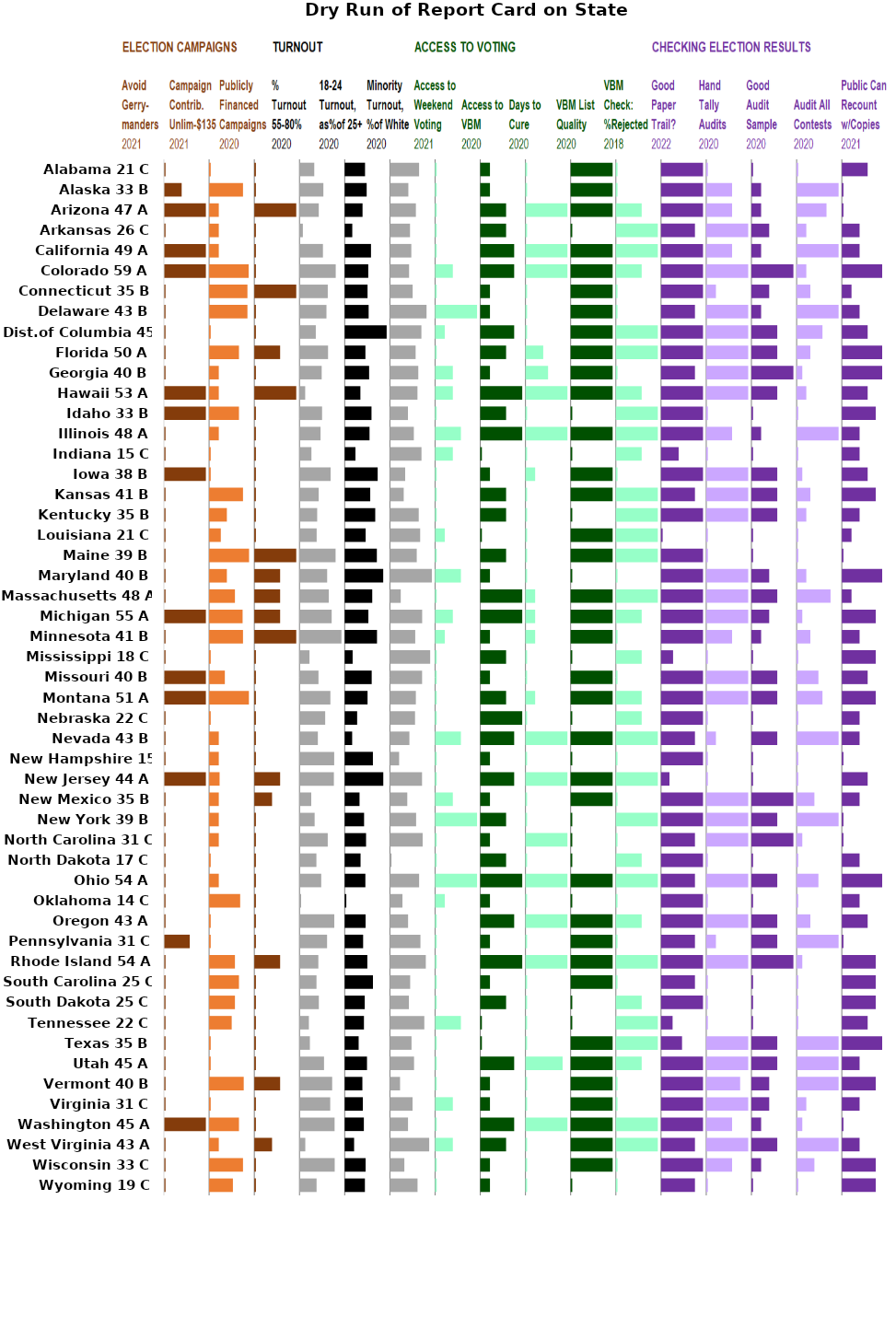
| Category | Nonpartisan or Bipartisan Redistricting to Avoid Gerrymanders | no | Contribution Limit per 4 Years per Candidate | cl | Public Campaign Finance for Governor+Legislature: | $ | Turnout: % of Voting-age Citizens: 2020: | tu | Ratio of 18-24 Turnout to 25+ Turnout: 2020: | t18 | Ratio of Minority Turnout to White Turnout: 2020: | tm | Weekend Early Voting: State Minimum 2021: | we | Access to Vote by Mail (VBM): 2020: | nr | Number of Days when Voters Can Cure Signature Problems after Election Day: | ho | Do They Maintain VBM List Well with Address Changes & Deaths? | go | Extent of Review of VBM: Rejection Rate: 2018: | ab | Handmarked Paper Ballots or Printed by Touchscreen? 2022: | do | Do They Audit Results by Hand Tallying Some Ballots? | ha | How Big Is Audit Sample? | ad | Number of Contests Audited: | nu | Can Public Recount with Copies of Ballots? | re |
|---|---|---|---|---|---|---|---|---|---|---|---|---|---|---|---|---|---|---|---|---|---|---|---|---|---|---|---|---|---|---|---|---|
| Alabama 21 C | 0.2 | 5.4 | 0.2 | 5.4 | 0.2 | 5.4 | 1.829 | 3.771 | 2.521 | 3.079 | 3.619 | 1.981 | 0.2 | 5.4 | 1.2 | 4.4 | 0.2 | 5.4 | 5.2 | 0.4 | 0.2 | 5.4 | 5.2 | 0.4 | 0.2 | 5.4 | 0.2 | 5.4 | 0.2 | 5.4 | 3.2 | 2.4 |
| Alaska 33 B | 2.2 | 3.4 | 4.2 | 1.4 | 0.2 | 5.4 | 2.958 | 2.642 | 2.724 | 2.876 | 2.288 | 3.312 | 0.2 | 5.4 | 1.2 | 4.4 | 0.2 | 5.4 | 5.2 | 0.4 | 0.2 | 5.4 | 5.2 | 0.4 | 3.2 | 2.4 | 1.2 | 4.4 | 5.2 | 0.4 | 0.2 | 5.4 |
| Arizona 47 A | 5.2 | 0.4 | 1.2 | 4.4 | 5.2 | 0.4 | 2.389 | 3.211 | 2.212 | 3.388 | 3.222 | 2.378 | 0.2 | 5.4 | 3.2 | 2.4 | 5.2 | 0.4 | 5.2 | 0.4 | 3.2 | 2.4 | 5.2 | 0.4 | 3.2 | 2.4 | 1.2 | 4.4 | 3.7 | 1.9 | 0.2 | 5.4 |
| Arkansas 26 C | 0.2 | 5.4 | 1.2 | 4.4 | 0.2 | 5.4 | 0.416 | 5.184 | 0.941 | 4.659 | 2.495 | 3.105 | 0.2 | 5.4 | 3.2 | 2.4 | 0.2 | 5.4 | 0.2 | 5.4 | 5.2 | 0.4 | 4.2 | 1.4 | 5.2 | 0.4 | 2.2 | 3.4 | 1.2 | 4.4 | 2.2 | 3.4 |
| California 49 A | 5.2 | 0.4 | 1.2 | 4.4 | 0.2 | 5.4 | 2.905 | 2.695 | 3.261 | 2.339 | 2.656 | 2.944 | 0.2 | 5.4 | 4.2 | 1.4 | 5.2 | 0.4 | 5.2 | 0.4 | 5.2 | 0.4 | 5.2 | 0.4 | 3.2 | 2.4 | 1.2 | 4.4 | 5.2 | 0.4 | 2.2 | 3.4 |
| Colorado 59 A | 5.2 | 0.4 | 4.9 | 0.7 | 0.2 | 5.4 | 4.49 | 1.11 | 2.921 | 2.679 | 2.379 | 3.221 | 2.2 | 3.4 | 4.2 | 1.4 | 5.2 | 0.4 | 5.2 | 0.4 | 3.2 | 2.4 | 5.2 | 0.4 | 5.2 | 0.4 | 5.2 | 0.4 | 1.2 | 4.4 | 5.2 | 0.4 |
| Connecticut 35 B | 0.2 | 5.4 | 4.75 | 0.85 | 5.2 | 0.4 | 3.504 | 2.096 | 2.832 | 2.768 | 2.82 | 2.78 | 0.2 | 5.4 | 1.2 | 4.4 | 0.2 | 5.4 | 5.2 | 0.4 | 0.2 | 5.4 | 5.2 | 0.4 | 1.2 | 4.4 | 2.2 | 3.4 | 1.7 | 3.9 | 1.2 | 4.4 |
| Delaware 43 B | 0.2 | 5.4 | 4.75 | 0.85 | 0.2 | 5.4 | 3.341 | 2.259 | 2.968 | 2.632 | 4.542 | 1.058 | 5.2 | 0.4 | 1.2 | 4.4 | 0.2 | 5.4 | 5.2 | 0.4 | 0.2 | 5.4 | 4.2 | 1.4 | 5.2 | 0.4 | 1.2 | 4.4 | 5.2 | 0.4 | 2.2 | 3.4 |
| Dist.of Columbia 45 A | 0.2 | 5.4 | 0.2 | 5.4 | 0.2 | 5.4 | 2.021 | 3.579 | 5.2 | 0.4 | 3.905 | 1.695 | 1.2 | 4.4 | 4.2 | 1.4 | 0.2 | 5.4 | 5.2 | 0.4 | 5.2 | 0.4 | 5.2 | 0.4 | 5.2 | 0.4 | 3.2 | 2.4 | 3.2 | 2.4 | 3.2 | 2.4 |
| Florida 50 A | 0.2 | 5.4 | 3.7 | 1.9 | 3.2 | 2.4 | 3.539 | 2.061 | 2.568 | 3.032 | 3.189 | 2.411 | 0.2 | 5.4 | 3.2 | 2.4 | 2.2 | 3.4 | 5.2 | 0.4 | 5.2 | 0.4 | 5.2 | 0.4 | 5.2 | 0.4 | 3.2 | 2.4 | 1.7 | 3.9 | 5.2 | 0.4 |
| Georgia 40 B | 0.2 | 5.4 | 1.2 | 4.4 | 0.2 | 5.4 | 2.75 | 2.85 | 3.028 | 2.572 | 3.519 | 2.081 | 2.2 | 3.4 | 1.2 | 4.4 | 2.8 | 2.8 | 5.2 | 0.4 | 0.2 | 5.4 | 4.2 | 1.4 | 5.2 | 0.4 | 5.2 | 0.4 | 0.7 | 4.9 | 5.2 | 0.4 |
| Hawaii 53 A | 5.2 | 0.4 | 1.2 | 4.4 | 5.2 | 0.4 | 0.707 | 4.893 | 1.946 | 3.654 | 3.416 | 2.184 | 2.2 | 3.4 | 5.2 | 0.4 | 5.2 | 0.4 | 5.2 | 0.4 | 3.2 | 2.4 | 5.2 | 0.4 | 5.2 | 0.4 | 3.2 | 2.4 | 1.2 | 4.4 | 3.2 | 2.4 |
| Idaho 33 B | 5.2 | 0.4 | 3.7 | 1.9 | 0.2 | 5.4 | 2.797 | 2.803 | 3.322 | 2.278 | 2.237 | 3.363 | 0.2 | 5.4 | 3.2 | 2.4 | 0.2 | 5.4 | 0.2 | 5.4 | 5.2 | 0.4 | 5.2 | 0.4 | 0.2 | 5.4 | 0.2 | 5.4 | 0.2 | 5.4 | 4.2 | 1.4 |
| Illinois 48 A | 0.2 | 5.4 | 1.2 | 4.4 | 0.2 | 5.4 | 2.609 | 2.991 | 3.078 | 2.522 | 2.968 | 2.632 | 3.2 | 2.4 | 5.2 | 0.4 | 5.2 | 0.4 | 5.2 | 0.4 | 5.2 | 0.4 | 5.2 | 0.4 | 3.2 | 2.4 | 1.2 | 4.4 | 5.2 | 0.4 | 2.2 | 3.4 |
| Indiana 15 C | 0.2 | 5.4 | 0.2 | 5.4 | 0.2 | 5.4 | 1.477 | 4.123 | 1.332 | 4.268 | 3.915 | 1.685 | 2.2 | 3.4 | 0.2 | 5.4 | 0.2 | 5.4 | 0.2 | 5.4 | 3.2 | 2.4 | 2.18 | 3.42 | 0.2 | 5.4 | 0.2 | 5.4 | 0.2 | 5.4 | 2.2 | 3.4 |
| Iowa 38 B | 5.2 | 0.4 | 0.2 | 5.4 | 0.2 | 5.4 | 3.856 | 1.744 | 4.088 | 1.512 | 1.895 | 3.705 | 0.2 | 5.4 | 1.2 | 4.4 | 1.2 | 4.4 | 5.2 | 0.4 | 0.2 | 5.4 | 5.2 | 0.4 | 5.2 | 0.4 | 3.2 | 2.4 | 0.7 | 4.9 | 3.2 | 2.4 |
| Kansas 41 B | 0.2 | 5.4 | 4.2 | 1.4 | 0.2 | 5.4 | 2.377 | 3.223 | 3.165 | 2.435 | 1.714 | 3.886 | 0.2 | 5.4 | 3.2 | 2.4 | 0.2 | 5.4 | 5.2 | 0.4 | 5.2 | 0.4 | 4.2 | 1.4 | 5.2 | 0.4 | 3.2 | 2.4 | 1.7 | 3.9 | 4.2 | 1.4 |
| Kentucky 35 B | 0.2 | 5.4 | 2.2 | 3.4 | 0.2 | 5.4 | 2.192 | 3.408 | 3.786 | 1.814 | 3.575 | 2.025 | 0.2 | 5.4 | 3.2 | 2.4 | 0.2 | 5.4 | 0.2 | 5.4 | 5.2 | 0.4 | 5.2 | 0.4 | 5.2 | 0.4 | 3.2 | 2.4 | 1.2 | 4.4 | 2.2 | 3.4 |
| Louisiana 21 C | 0.2 | 5.4 | 1.45 | 4.15 | 0.2 | 5.4 | 2.127 | 3.473 | 2.597 | 3.003 | 3.751 | 1.849 | 1.2 | 4.4 | 0.2 | 5.4 | 0.2 | 5.4 | 5.2 | 0.4 | 5.2 | 0.4 | 0.2 | 5.4 | 0.2 | 5.4 | 0.2 | 5.4 | 0.2 | 5.4 | 1.2 | 4.4 |
| Maine 39 B | 0.2 | 5.4 | 4.952 | 0.648 | 5.2 | 0.4 | 4.472 | 1.128 | 3.986 | 1.614 | 3.329 | 2.271 | 0.2 | 5.4 | 3.2 | 2.4 | 0.2 | 5.4 | 5.2 | 0.4 | 5.2 | 0.4 | 5.2 | 0.4 | 0.2 | 5.4 | 0.2 | 5.4 | 0.2 | 5.4 | 0.2 | 5.4 |
| Maryland 40 B | 0.2 | 5.4 | 2.2 | 3.4 | 3.2 | 2.4 | 3.427 | 2.173 | 4.773 | 0.827 | 5.2 | 0.4 | 3.2 | 2.4 | 1.2 | 4.4 | 0.2 | 5.4 | 0.2 | 5.4 | 0.2 | 5.4 | 5.2 | 0.4 | 5.2 | 0.4 | 2.2 | 3.4 | 1.2 | 4.4 | 5.2 | 0.4 |
| Massachusetts 48 A | 0.2 | 5.4 | 3.2 | 2.4 | 3.2 | 2.4 | 3.628 | 1.972 | 3.413 | 2.187 | 1.344 | 4.256 | 0.2 | 5.4 | 5.2 | 0.4 | 1.2 | 4.4 | 5.2 | 0.4 | 5.2 | 0.4 | 5.2 | 0.4 | 5.2 | 0.4 | 3.2 | 2.4 | 4.2 | 1.4 | 1.2 | 4.4 |
| Michigan 55 A | 5.2 | 0.4 | 4.15 | 1.45 | 3.2 | 2.4 | 3.986 | 1.614 | 2.935 | 2.665 | 4 | 1.6 | 2.2 | 3.4 | 5.2 | 0.4 | 1.2 | 4.4 | 5.2 | 0.4 | 3.2 | 2.4 | 5.2 | 0.4 | 5.2 | 0.4 | 2.2 | 3.4 | 0.7 | 4.9 | 4.2 | 1.4 |
| Minnesota 41 B | 0.2 | 5.4 | 4.2 | 1.4 | 5.2 | 0.4 | 5.2 | 0.4 | 4.004 | 1.596 | 3.141 | 2.459 | 1.2 | 4.4 | 1.2 | 4.4 | 1.2 | 4.4 | 5.2 | 0.4 | 0.2 | 5.4 | 5.2 | 0.4 | 3.2 | 2.4 | 1.2 | 4.4 | 1.7 | 3.9 | 2.2 | 3.4 |
| Mississippi 18 C | 0.2 | 5.4 | 0.2 | 5.4 | 0.2 | 5.4 | 1.238 | 4.362 | 0.985 | 4.615 | 4.991 | 0.609 | 0.2 | 5.4 | 3.2 | 2.4 | 0.2 | 5.4 | 0.2 | 5.4 | 3.2 | 2.4 | 1.49 | 4.11 | 0.2 | 5.4 | 0.2 | 5.4 | 0.2 | 5.4 | 4.2 | 1.4 |
| Missouri 40 B | 5.2 | 0.4 | 1.95 | 3.65 | 0.2 | 5.4 | 2.352 | 3.248 | 3.347 | 2.253 | 3.991 | 1.609 | 0.2 | 5.4 | 1.2 | 4.4 | 0.2 | 5.4 | 5.2 | 0.4 | 0.2 | 5.4 | 5.2 | 0.4 | 5.2 | 0.4 | 3.2 | 2.4 | 2.7 | 2.9 | 3.2 | 2.4 |
| Montana 51 A | 5.2 | 0.4 | 4.93 | 0.67 | 0.2 | 5.4 | 3.827 | 1.773 | 2.833 | 2.767 | 3.217 | 2.383 | 0.2 | 5.4 | 3.2 | 2.4 | 1.2 | 4.4 | 5.2 | 0.4 | 3.2 | 2.4 | 5.2 | 0.4 | 5.2 | 0.4 | 3.2 | 2.4 | 3.2 | 2.4 | 4.2 | 1.4 |
| Nebraska 22 C | 0.2 | 5.4 | 0.2 | 5.4 | 0.2 | 5.4 | 3.183 | 2.417 | 1.543 | 4.057 | 3.116 | 2.484 | 0.2 | 5.4 | 5.2 | 0.4 | 0.2 | 5.4 | 0.2 | 5.4 | 3.2 | 2.4 | 5.2 | 0.4 | 0.2 | 5.4 | 0.2 | 5.4 | 0.2 | 5.4 | 2.2 | 3.4 |
| Nevada 43 B | 0.2 | 5.4 | 1.2 | 4.4 | 0.2 | 5.4 | 2.276 | 3.324 | 0.926 | 4.674 | 2.418 | 3.182 | 3.2 | 2.4 | 4.2 | 1.4 | 5.2 | 0.4 | 5.2 | 0.4 | 5.2 | 0.4 | 4.2 | 1.4 | 1.2 | 4.4 | 3.2 | 2.4 | 5.2 | 0.4 | 2.2 | 3.4 |
| New Hampshire 15 C | 0.2 | 5.4 | 1.2 | 4.4 | 0.2 | 5.4 | 4.299 | 1.301 | 3.496 | 2.104 | 1.145 | 4.455 | 0.2 | 5.4 | 1.2 | 4.4 | 0.2 | 5.4 | 0.2 | 5.4 | 0.2 | 5.4 | 5.2 | 0.4 | 0.2 | 5.4 | 0.2 | 5.4 | 0.2 | 5.4 | 0.2 | 5.4 |
| New Jersey 44 A | 5.2 | 0.4 | 1.3 | 4.3 | 3.2 | 2.4 | 4.26 | 1.34 | 4.782 | 0.818 | 3.984 | 1.616 | 0.2 | 5.4 | 4.2 | 1.4 | 5.2 | 0.4 | 5.2 | 0.4 | 5.2 | 0.4 | 1.04 | 4.56 | 0.2 | 5.4 | 0.2 | 5.4 | 0.2 | 5.4 | 3.2 | 2.4 |
| New Mexico 35 B | 0.2 | 5.4 | 1.2 | 4.4 | 2.2 | 3.4 | 1.454 | 4.146 | 1.839 | 3.761 | 2.156 | 3.444 | 2.2 | 3.4 | 1.2 | 4.4 | 0.2 | 5.4 | 5.2 | 0.4 | 0.2 | 5.4 | 5.2 | 0.4 | 5.2 | 0.4 | 5.2 | 0.4 | 2.2 | 3.4 | 2.2 | 3.4 |
| New York 39 B | 0.2 | 5.4 | 1.2 | 4.4 | 0.2 | 5.4 | 1.876 | 3.724 | 2.403 | 3.197 | 3.251 | 2.349 | 5.2 | 0.4 | 3.2 | 2.4 | 0.2 | 5.4 | 0.2 | 5.4 | 5.2 | 0.4 | 5.2 | 0.4 | 5.2 | 0.4 | 3.2 | 2.4 | 5.2 | 0.4 | 0.2 | 5.4 |
| North Carolina 31 C | 0.2 | 5.4 | 1.2 | 4.4 | 0.2 | 5.4 | 3.501 | 2.099 | 2.648 | 2.952 | 4.059 | 1.541 | 0.2 | 5.4 | 1.2 | 4.4 | 5.2 | 0.4 | 0.2 | 5.4 | 0.2 | 5.4 | 4.2 | 1.4 | 5.2 | 0.4 | 5.2 | 0.4 | 0.7 | 4.9 | 0.2 | 5.4 |
| North Dakota 17 C | 0.2 | 5.4 | 0.2 | 5.4 | 0.2 | 5.4 | 2.095 | 3.505 | 1.966 | 3.634 | 0.2 | 5.4 | 0.2 | 5.4 | 3.2 | 2.4 | 0.2 | 5.4 | 0.2 | 5.4 | 3.2 | 2.4 | 5.2 | 0.4 | 0.2 | 5.4 | 0.2 | 5.4 | 0.2 | 5.4 | 2.2 | 3.4 |
| Ohio 54 A | 0.2 | 5.4 | 1.2 | 4.4 | 0.2 | 5.4 | 2.692 | 2.908 | 2.563 | 3.037 | 3.622 | 1.978 | 5.2 | 0.4 | 5.2 | 0.4 | 5.2 | 0.4 | 5.2 | 0.4 | 5.2 | 0.4 | 4.2 | 1.4 | 5.2 | 0.4 | 3.2 | 2.4 | 2.7 | 2.9 | 5.2 | 0.4 |
| Oklahoma 14 C | 0.2 | 5.4 | 3.85 | 1.75 | 0.2 | 5.4 | 0.2 | 5.4 | 0.2 | 5.4 | 1.558 | 4.042 | 1.2 | 4.4 | 1.2 | 4.4 | 0.2 | 5.4 | 0.2 | 5.4 | 0.2 | 5.4 | 5.2 | 0.4 | 0.2 | 5.4 | 0.2 | 5.4 | 0.2 | 5.4 | 2.2 | 3.4 |
| Oregon 43 A | 0.2 | 5.4 | 0.2 | 5.4 | 0.2 | 5.4 | 4.311 | 1.289 | 2.587 | 3.013 | 2.253 | 3.347 | 0.2 | 5.4 | 4.2 | 1.4 | 5.2 | 0.4 | 5.2 | 0.4 | 3.2 | 2.4 | 5.2 | 0.4 | 5.2 | 0.4 | 3.2 | 2.4 | 1.7 | 3.9 | 3.2 | 2.4 |
| Pennsylvania 31 C | 3.2 | 2.4 | 0.2 | 5.4 | 0.2 | 5.4 | 3.416 | 2.184 | 2.285 | 3.315 | 3.785 | 1.815 | 0.2 | 5.4 | 1.2 | 4.4 | 0.2 | 5.4 | 5.2 | 0.4 | 0.2 | 5.4 | 4.2 | 1.4 | 1.2 | 4.4 | 3.2 | 2.4 | 5.2 | 0.4 | 0.2 | 5.4 |
| Rhode Island 54 A | 0.2 | 5.4 | 3.2 | 2.4 | 3.2 | 2.4 | 2.335 | 3.265 | 2.806 | 2.794 | 4.451 | 1.149 | 0.2 | 5.4 | 5.2 | 0.4 | 5.2 | 0.4 | 5.2 | 0.4 | 5.2 | 0.4 | 5.2 | 0.4 | 5.2 | 0.4 | 5.2 | 0.4 | 0.7 | 4.9 | 4.2 | 1.4 |
| South Carolina 25 C | 0.2 | 5.4 | 3.7 | 1.9 | 0.2 | 5.4 | 2.107 | 3.493 | 3.501 | 2.099 | 2.514 | 3.086 | 0.2 | 5.4 | 1.2 | 4.4 | 0.2 | 5.4 | 5.2 | 0.4 | 0.2 | 5.4 | 4.2 | 1.4 | 0.2 | 5.4 | 0.2 | 5.4 | 0.2 | 5.4 | 4.2 | 1.4 |
| South Dakota 25 C | 0.2 | 5.4 | 3.2 | 2.4 | 0.2 | 5.4 | 2.398 | 3.202 | 2.485 | 3.115 | 2.357 | 3.243 | 0.2 | 5.4 | 3.2 | 2.4 | 0.2 | 5.4 | 0.2 | 5.4 | 3.2 | 2.4 | 5.2 | 0.4 | 0.2 | 5.4 | 0.2 | 5.4 | 0.2 | 5.4 | 4.2 | 1.4 |
| Tennessee 22 C | 0.2 | 5.4 | 2.8 | 2.8 | 0.2 | 5.4 | 1.164 | 4.436 | 2.386 | 3.214 | 4.266 | 1.334 | 3.2 | 2.4 | 0.2 | 5.4 | 0.2 | 5.4 | 0.2 | 5.4 | 5.2 | 0.4 | 1.43 | 4.17 | 0.2 | 5.4 | 0.2 | 5.4 | 0.2 | 5.4 | 3.2 | 2.4 |
| Texas 35 B | 0.2 | 5.4 | 0.2 | 5.4 | 0.2 | 5.4 | 1.288 | 4.312 | 1.729 | 3.871 | 2.682 | 2.918 | 0.2 | 5.4 | 0.2 | 5.4 | 0.2 | 5.4 | 5.2 | 0.4 | 5.2 | 0.4 | 2.6 | 3 | 5.2 | 0.4 | 3.2 | 2.4 | 5.2 | 0.4 | 5.2 | 0.4 |
| Utah 45 A | 0.2 | 5.4 | 0.2 | 5.4 | 0.2 | 5.4 | 3.039 | 2.561 | 2.764 | 2.836 | 2.993 | 2.607 | 0.2 | 5.4 | 4.2 | 1.4 | 4.6 | 1 | 5.2 | 0.4 | 3.2 | 2.4 | 5.2 | 0.4 | 5.2 | 0.4 | 3.2 | 2.4 | 5.2 | 0.4 | 2.2 | 3.4 |
| Vermont 40 B | 0.2 | 5.4 | 4.29 | 1.31 | 3.2 | 2.4 | 4.049 | 1.551 | 2.192 | 3.408 | 1.26 | 4.34 | 0.2 | 5.4 | 1.2 | 4.4 | 0.2 | 5.4 | 5.2 | 0.4 | 0.2 | 5.4 | 5.2 | 0.4 | 4.2 | 1.4 | 2.2 | 3.4 | 5.2 | 0.4 | 4.2 | 1.4 |
| Virginia 31 C | 0.2 | 5.4 | 0.2 | 5.4 | 0.2 | 5.4 | 3.807 | 1.793 | 2.247 | 3.353 | 2.811 | 2.789 | 2.2 | 3.4 | 1.2 | 4.4 | 0.2 | 5.4 | 5.2 | 0.4 | 0.2 | 5.4 | 5.2 | 0.4 | 5.2 | 0.4 | 2.2 | 3.4 | 1.2 | 4.4 | 2.2 | 3.4 |
| Washington 45 A | 5.2 | 0.4 | 3.7 | 1.9 | 0.2 | 5.4 | 4.349 | 1.251 | 2.375 | 3.225 | 2.246 | 3.354 | 0.2 | 5.4 | 4.2 | 1.4 | 5.2 | 0.4 | 5.2 | 0.4 | 5.2 | 0.4 | 5.2 | 0.4 | 3.2 | 2.4 | 1.2 | 4.4 | 0.7 | 4.9 | 0.2 | 5.4 |
| West Virginia 43 A | 0.2 | 5.4 | 1.2 | 4.4 | 2.2 | 3.4 | 0.719 | 4.881 | 1.166 | 4.434 | 4.87 | 0.73 | 2.2 | 3.4 | 3.2 | 2.4 | 0.2 | 5.4 | 5.2 | 0.4 | 5.2 | 0.4 | 4.2 | 1.4 | 5.2 | 0.4 | 3.2 | 2.4 | 5.2 | 0.4 | 2.2 | 3.4 |
| Wisconsin 33 C | 0.2 | 5.4 | 4.2 | 1.4 | 0.2 | 5.4 | 4.361 | 1.239 | 2.594 | 3.006 | 1.791 | 3.809 | 0.2 | 5.4 | 1.2 | 4.4 | 0.2 | 5.4 | 5.2 | 0.4 | 0.2 | 5.4 | 5.2 | 0.4 | 3.2 | 2.4 | 1.2 | 4.4 | 2.2 | 3.4 | 4.2 | 1.4 |
| Wyoming 19 C | 0.2 | 5.4 | 2.95 | 2.65 | 0.2 | 5.4 | 2.117 | 3.483 | 2.505 | 3.095 | 3.426 | 2.174 | 0.2 | 5.4 | 1.2 | 4.4 | 0.2 | 5.4 | 0.2 | 5.4 | 0.2 | 5.4 | 4.2 | 1.4 | 0.2 | 5.4 | 0.2 | 5.4 | 0.2 | 5.4 | 4.2 | 1.4 |